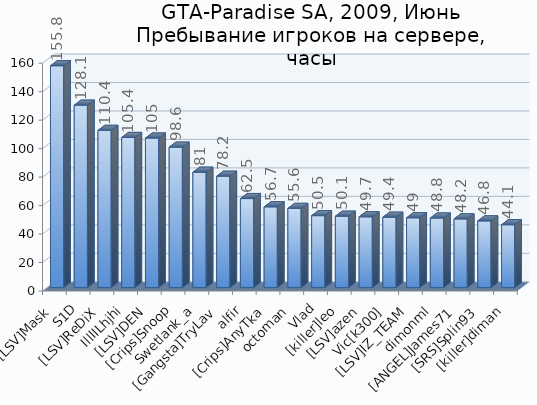
| Category | Series 0 |
|---|---|
| [LSV]Mask | 155.8 |
| S1D | 128.1 |
| [LSV]ReDiX | 110.4 |
| IllIILhjhi | 105.4 |
| [LSV]DEN | 105 |
| [Crips]Snoop | 98.6 |
| Swetlank_a | 81 |
| [Gangsta]TryLav | 78.2 |
| alfir | 62.5 |
| [Crips]AnyTka | 56.7 |
| octoman | 55.6 |
| Vlad | 50.5 |
| [killer]leo | 50.1 |
| [LSV]azen | 49.7 |
| Vic[k300] | 49.4 |
| [LSV]IZ_TEAM | 49 |
| dimonml | 48.8 |
| [ANGEL]James71 | 48.2 |
| [SRS]Splin93 | 46.8 |
| [killer]diman | 44.1 |